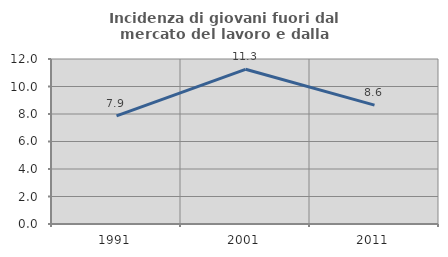
| Category | Incidenza di giovani fuori dal mercato del lavoro e dalla formazione  |
|---|---|
| 1991.0 | 7.869 |
| 2001.0 | 11.25 |
| 2011.0 | 8.642 |